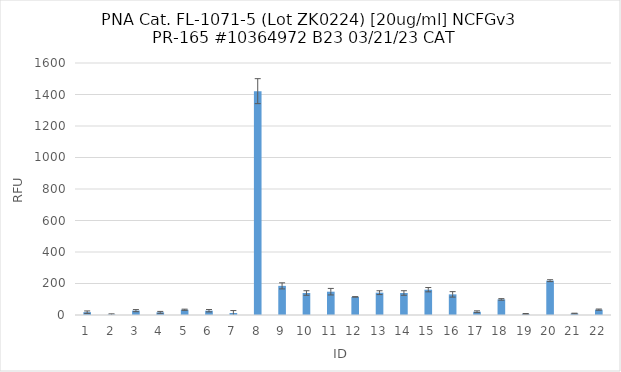
| Category | RFU |
|---|---|
| 0 | 18 |
| 1 | 3 |
| 2 | 27.75 |
| 3 | 16.75 |
| 4 | 33.25 |
| 5 | 27.25 |
| 6 | 12.75 |
| 7 | 1421.25 |
| 8 | 185 |
| 9 | 139.75 |
| 10 | 148 |
| 11 | 115 |
| 12 | 141.75 |
| 13 | 139.75 |
| 14 | 160.75 |
| 15 | 131 |
| 16 | 20.75 |
| 17 | 99 |
| 18 | 7 |
| 19 | 218 |
| 20 | 9.5 |
| 21 | 34 |